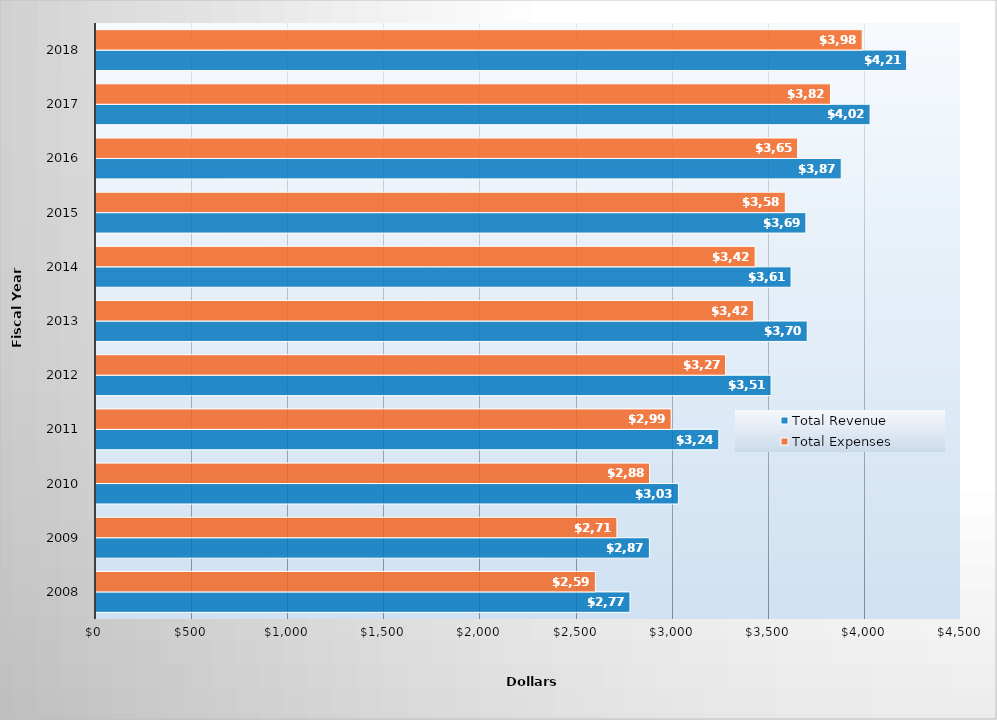
| Category | Total Revenue | Total Expenses |
|---|---|---|
| 2008.0 | 2778 | 2598 |
| 2009.0 | 2879 | 2710 |
| 2010.0 | 3030 | 2880 |
| 2011.0 | 3240 | 2992 |
| 2012.0 | 3512 | 3275 |
| 2013.0 | 3700 | 3422 |
| 2014.0 | 3616 | 3429 |
| 2015.0 | 3693 | 3586 |
| 2016.0 | 3877 | 3650 |
| 2017.0 | 4027 | 3821 |
| 2018.0 | 4217 | 3986 |